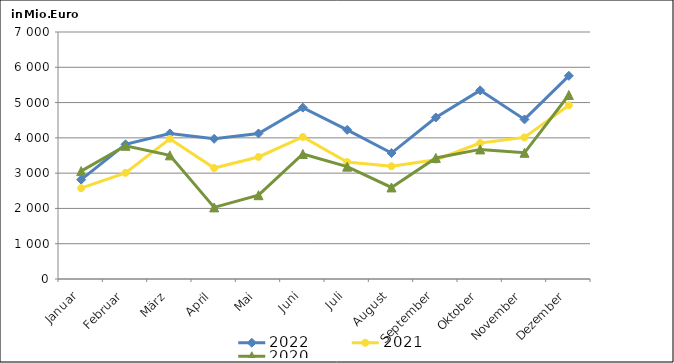
| Category | 2022 | 2021 | 2020 |
|---|---|---|---|
| Januar | 2814.56 | 2573.967 | 3057.829 |
| Februar | 3816.369 | 3007.278 | 3775.255 |
| März | 4124.865 | 3974.693 | 3504.185 |
| April | 3972.268 | 3145.094 | 2029.114 |
| Mai | 4123.832 | 3458.148 | 2375.05 |
| Juni | 4857.352 | 4024.847 | 3542.224 |
| Juli | 4227.19 | 3313.896 | 3184.067 |
| August | 3569.32 | 3194.513 | 2595.227 |
| September | 4577.171 | 3379.007 | 3430.422 |
| Oktober | 5345.788 | 3852.571 | 3672.982 |
| November | 4522.121 | 4012.416 | 3576.665 |
| Dezember | 5757.956 | 4923.29 | 5215.398 |